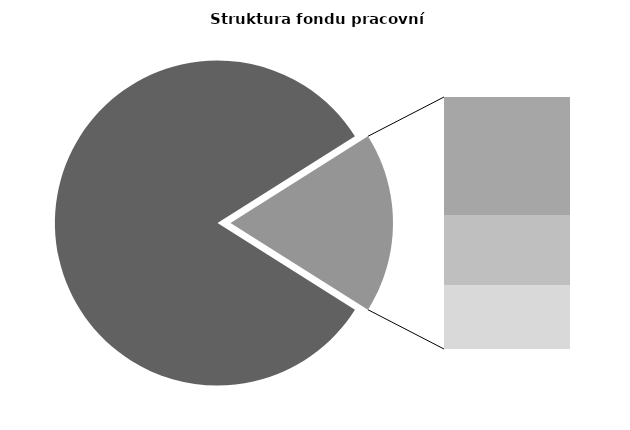
| Category | Series 0 |
|---|---|
| Průměrná měsíční odpracovaná doba bez přesčasu | 139.525 |
| Dovolená | 14.253 |
| Nemoc | 8.474 |
| Jiné | 7.727 |